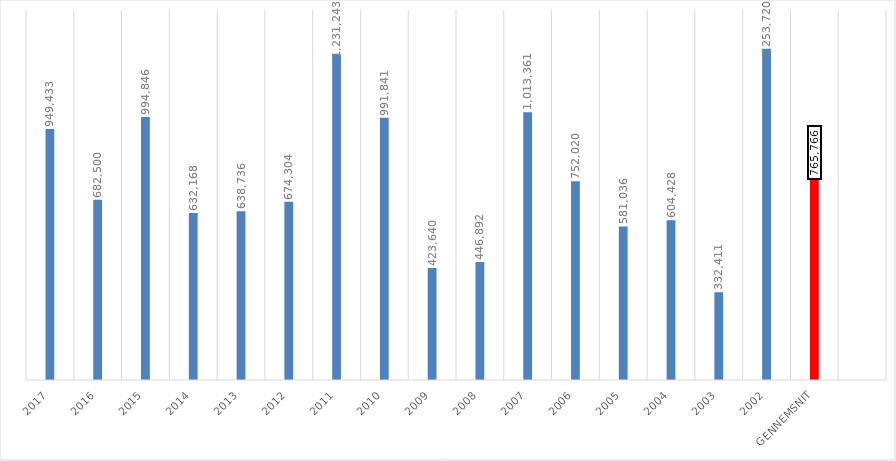
| Category | Series 0 |
|---|---|
| 2017 | 949433 |
| 2016 | 682500 |
| 2015 | 994846 |
| 2014 | 632168 |
| 2013 | 638736 |
| 2012 | 674304 |
| 2011 | 1231243 |
| 2010 | 991841 |
| 2009 | 423640 |
| 2008 | 446892 |
| 2007 | 1013361 |
| 2006 | 752020 |
| 2005 | 581036 |
| 2004 | 604428 |
| 2003 | 332411 |
| 2002 | 1253720 |
| Gennemsnit | 765765.562 |